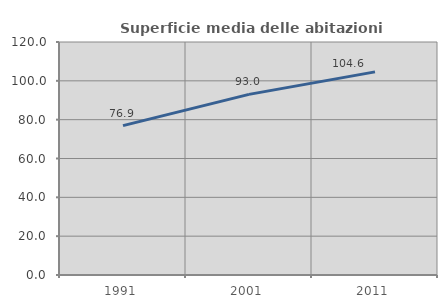
| Category | Superficie media delle abitazioni occupate |
|---|---|
| 1991.0 | 76.925 |
| 2001.0 | 93.018 |
| 2011.0 | 104.625 |